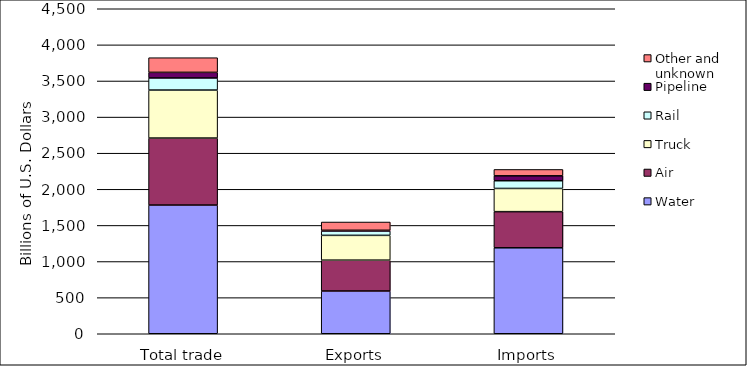
| Category | Water | Air | Truck | Rail | Pipeline | Other and unknown |
|---|---|---|---|---|---|---|
| Total trade | 1782.247 | 927.345 | 664.739 | 167.504 | 77.439 | 203 |
| Exports | 592.122 | 426.884 | 343.388 | 60.679 | 9.492 | 114.573 |
| Imports | 1190.125 | 500.461 | 321.351 | 106.825 | 67.947 | 88.333 |